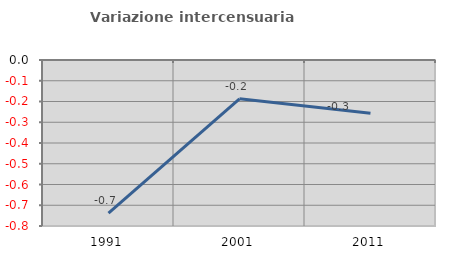
| Category | Variazione intercensuaria annua |
|---|---|
| 1991.0 | -0.738 |
| 2001.0 | -0.187 |
| 2011.0 | -0.257 |